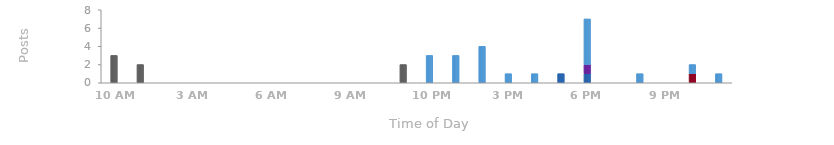
| Category | Monday | Tuesday | Wednesday | Thursday | Friday | Saturday | Sunday |
|---|---|---|---|---|---|---|---|
| 0.0 | 3 | 0 | 0 | 0 | 0 | 0 | 0 |
| 0.041666666666666664 | 2 | 0 | 0 | 0 | 0 | 0 | 0 |
| 0.08333333333333333 | 0 | 0 | 0 | 0 | 0 | 0 | 0 |
| 0.125 | 0 | 0 | 0 | 0 | 0 | 0 | 0 |
| 0.16666666666666666 | 0 | 0 | 0 | 0 | 0 | 0 | 0 |
| 0.20833333333333331 | 0 | 0 | 0 | 0 | 0 | 0 | 0 |
| 0.24999999999999997 | 0 | 0 | 0 | 0 | 0 | 0 | 0 |
| 0.29166666666666663 | 0 | 0 | 0 | 0 | 0 | 0 | 0 |
| 0.3333333333333333 | 0 | 0 | 0 | 0 | 0 | 0 | 0 |
| 0.375 | 0 | 0 | 0 | 0 | 0 | 0 | 0 |
| 0.4166666666666667 | 0 | 0 | 0 | 0 | 0 | 0 | 0 |
| 0.45833333333333337 | 2 | 0 | 0 | 0 | 0 | 0 | 0 |
| 0.5 | 0 | 0 | 0 | 0 | 0 | 0 | 3 |
| 0.5416666666666666 | 0 | 0 | 0 | 0 | 0 | 0 | 3 |
| 0.5833333333333333 | 0 | 0 | 0 | 0 | 0 | 0 | 4 |
| 0.6249999999999999 | 0 | 0 | 0 | 0 | 0 | 0 | 1 |
| 0.6666666666666665 | 0 | 0 | 0 | 0 | 0 | 0 | 1 |
| 0.7083333333333331 | 0 | 0 | 1 | 0 | 0 | 0 | 0 |
| 0.7499999999999998 | 0 | 0 | 1 | 1 | 0 | 0 | 5 |
| 0.7916666666666664 | 0 | 0 | 0 | 0 | 0 | 0 | 0 |
| 0.833333333333333 | 0 | 0 | 0 | 0 | 0 | 0 | 1 |
| 0.8749999999999997 | 0 | 0 | 0 | 0 | 0 | 0 | 0 |
| 0.9166666666666663 | 0 | 0 | 0 | 0 | 0 | 1 | 1 |
| 0.9583333333333329 | 0 | 0 | 0 | 0 | 0 | 0 | 1 |